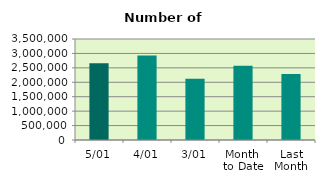
| Category | Series 0 |
|---|---|
| 5/01 | 2655600 |
| 4/01 | 2927948 |
| 3/01 | 2122790 |
| Month 
to Date | 2568779.333 |
| Last
Month | 2284008.087 |